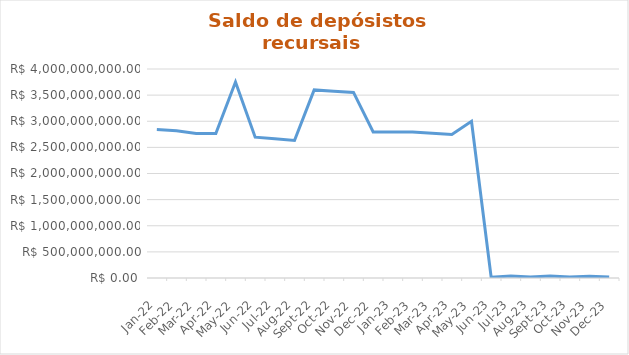
| Category | Series 0 |
|---|---|
| 2022-01-01 | 2840723516.31 |
| 2022-02-01 | 2819249116.7 |
| 2022-03-01 | 2764997539.53 |
| 2022-04-01 | 2764997539.53 |
| 2022-05-01 | 3750263740.45 |
| 2022-06-01 | 2694982647.94 |
| 2022-07-01 | 2666823474.67 |
| 2022-08-01 | 2632448935.34 |
| 2022-09-01 | 3600351507.26 |
| 2022-10-01 | 3572448819.69 |
| 2022-11-01 | 3552064264.04 |
| 2022-12-01 | 2794443171.57 |
| 2023-01-01 | 2794443171.57 |
| 2023-02-01 | 2794443171.57 |
| 2023-03-01 | 2769350244.38 |
| 2023-04-01 | 2748530506.88 |
| 2023-05-01 | 2998083465.75 |
| 2023-06-01 | 12480347 |
| 2023-07-01 | 38597209 |
| 2023-08-01 | 17066151 |
| 2023-09-01 | 38038821 |
| 2023-10-01 | 18570875 |
| 2023-11-01 | 34837082 |
| 2023-12-01 | 20072522 |